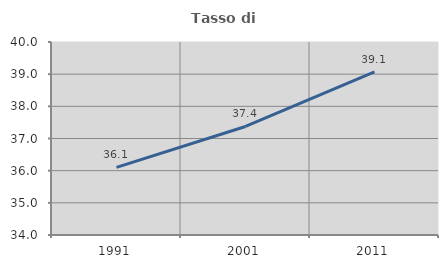
| Category | Tasso di occupazione   |
|---|---|
| 1991.0 | 36.102 |
| 2001.0 | 37.374 |
| 2011.0 | 39.073 |